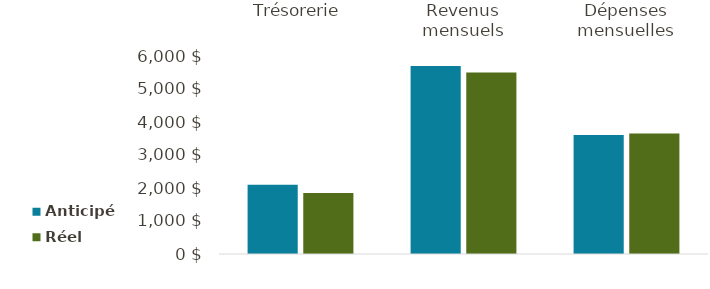
| Category | Anticipé | Réel |
|---|---|---|
| Trésorerie | 2097 | 1845 |
| Revenus mensuels | 5700 | 5500 |
| Dépenses mensuelles | 3603 | 3655 |